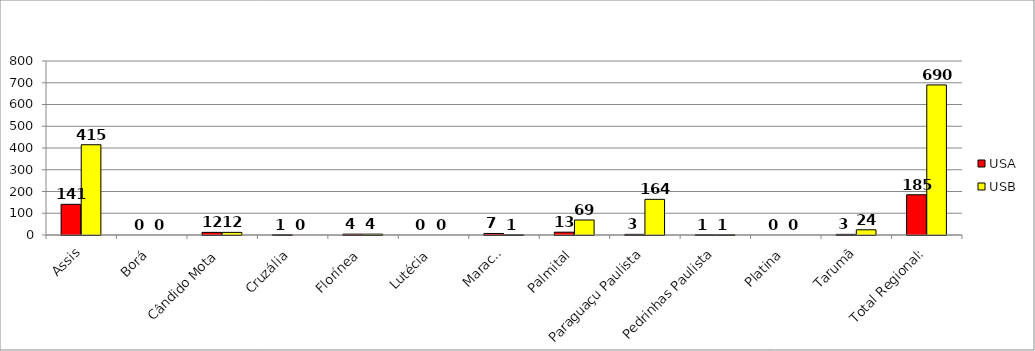
| Category | USA | USB |
|---|---|---|
| Assis | 141 | 415 |
| Borá | 0 | 0 |
| Cândido Mota | 12 | 12 |
| Cruzália | 1 | 0 |
| Florínea | 4 | 4 |
| Lutécia | 0 | 0 |
| Maracaí | 7 | 1 |
| Palmital | 13 | 69 |
| Paraguaçu Paulista | 3 | 164 |
| Pedrinhas Paulista | 1 | 1 |
| Platina | 0 | 0 |
| Tarumã | 3 | 24 |
| Total Regional: | 185 | 690 |